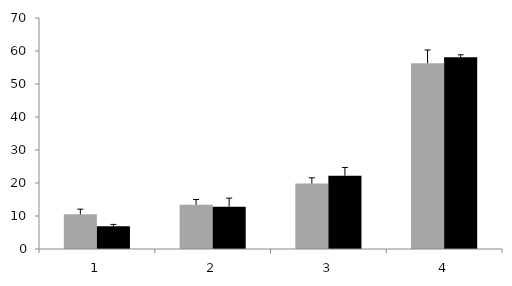
| Category | Series 0 | Series 1 |
|---|---|---|
| 0 | 10.502 | 6.884 |
| 1 | 13.404 | 12.79 |
| 2 | 19.827 | 22.211 |
| 3 | 56.267 | 58.114 |